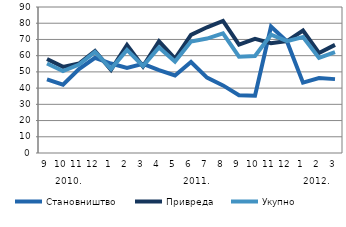
| Category | Становништво | Привреда | Укупно |
|---|---|---|---|
| 0 | 45.389 | 57.915 | 55.179 |
| 1 | 42.124 | 53.08 | 50.555 |
| 2 | 51.771 | 55.142 | 54.506 |
| 3 | 58.656 | 62.902 | 62.308 |
| 4 | 55.148 | 51.224 | 51.844 |
| 5 | 52.497 | 66.608 | 63.587 |
| 6 | 54.936 | 53.383 | 53.662 |
| 7 | 51.151 | 68.819 | 65.075 |
| 8 | 47.82 | 58.115 | 56.362 |
| 9 | 56.101 | 72.803 | 68.703 |
| 10 | 46.5 | 77.478 | 70.544 |
| 11 | 41.68 | 81.373 | 73.688 |
| 12 | 35.603 | 66.791 | 59.398 |
| 13 | 35.359 | 70.313 | 59.776 |
| 14 | 77.897 | 67.711 | 72.904 |
| 15 | 68.772 | 69.006 | 68.942 |
| 16 | 43.38 | 75.463 | 71.493 |
| 17 | 46.219 | 61.663 | 58.629 |
| 18 | 45.54 | 66.642 | 62.142 |